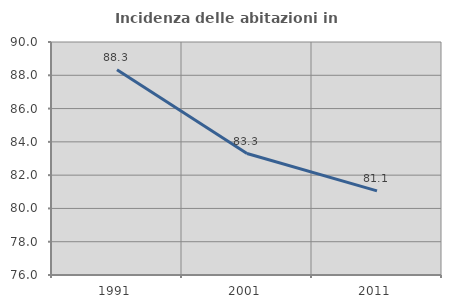
| Category | Incidenza delle abitazioni in proprietà  |
|---|---|
| 1991.0 | 88.339 |
| 2001.0 | 83.299 |
| 2011.0 | 81.055 |